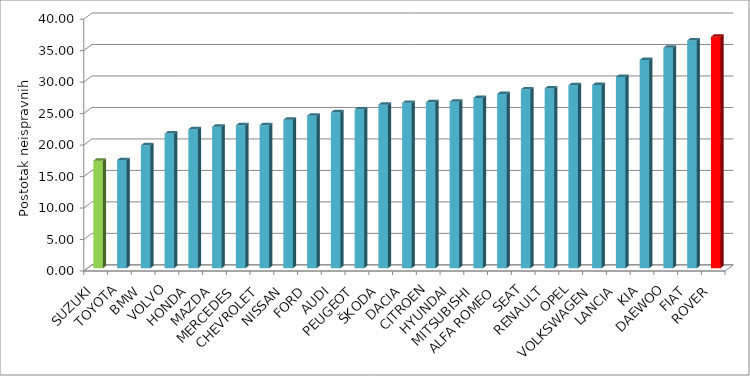
| Category | Series 4 |
|---|---|
| SUZUKI | 17.069 |
| TOYOTA | 17.175 |
| BMW | 19.525 |
| VOLVO | 21.391 |
| HONDA | 22.078 |
| MAZDA | 22.475 |
| MERCEDES | 22.705 |
| CHEVROLET | 22.725 |
| NISSAN | 23.592 |
| FORD | 24.225 |
| AUDI | 24.77 |
| PEUGEOT | 25.234 |
| ŠKODA | 25.981 |
| DACIA | 26.263 |
| CITROEN | 26.354 |
| HYUNDAI | 26.449 |
| MITSUBISHI | 27.03 |
| ALFA ROMEO | 27.684 |
| SEAT | 28.411 |
| RENAULT | 28.555 |
| OPEL | 29.053 |
| VOLKSWAGEN | 29.102 |
| LANCIA | 30.388 |
| KIA | 33.069 |
| DAEWOO | 35.024 |
| FIAT | 36.163 |
| ROVER | 36.757 |